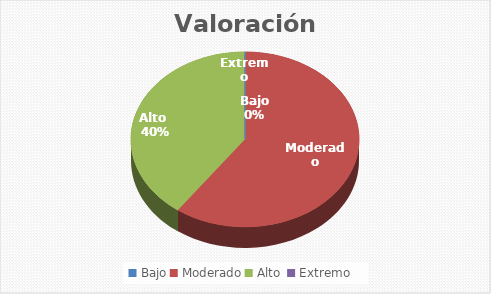
| Category | Valoración Residual |
|---|---|
| Bajo | 0 |
| Moderado | 6 |
| Alto  | 4 |
| Extremo | 0 |